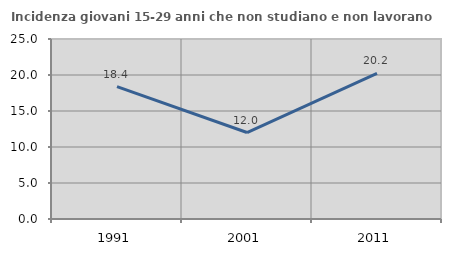
| Category | Incidenza giovani 15-29 anni che non studiano e non lavorano  |
|---|---|
| 1991.0 | 18.395 |
| 2001.0 | 12.01 |
| 2011.0 | 20.235 |